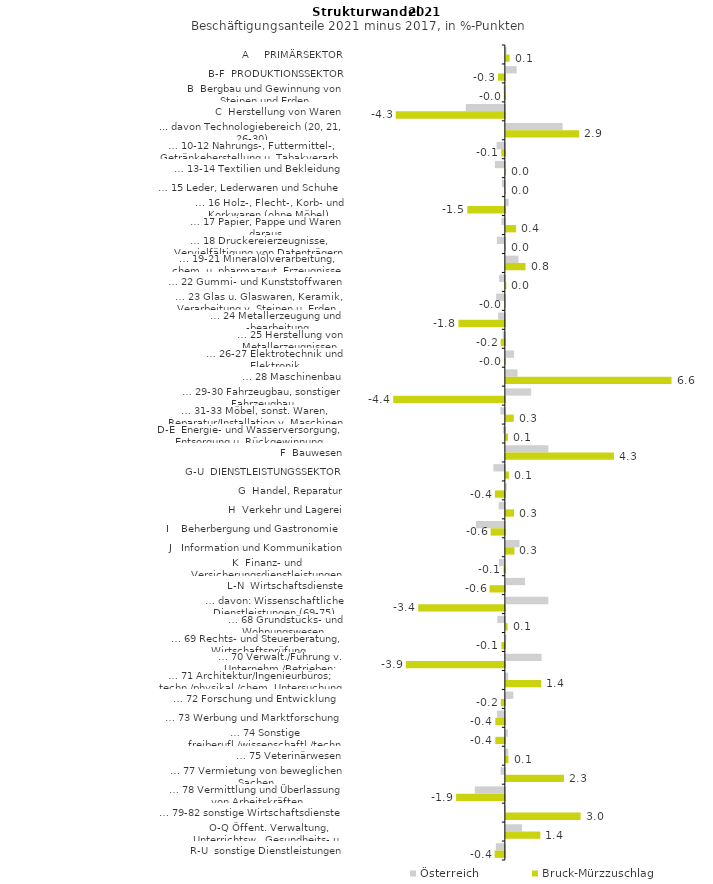
| Category | Österreich | Bruck-Mürzzuschlag |
|---|---|---|
| A     PRIMÄRSEKTOR | 0.029 | 0.15 |
| B-F  PRODUKTIONSSEKTOR | 0.429 | -0.272 |
| B  Bergbau und Gewinnung von Steinen und Erden | -0.054 | -0.041 |
| C  Herstellung von Waren | -1.552 | -4.341 |
| ... davon Technologiebereich (20, 21, 26-30) | 2.256 | 2.916 |
| … 10-12 Nahrungs-, Futtermittel-, Getränkeherstellung u. Tabakverarb. | -0.33 | -0.143 |
| … 13-14 Textilien und Bekleidung | -0.397 | 0.009 |
| … 15 Leder, Lederwaren und Schuhe | -0.119 | 0 |
| … 16 Holz-, Flecht-, Korb- und Korkwaren (ohne Möbel)  | 0.11 | -1.494 |
| … 17 Papier, Pappe und Waren daraus  | -0.136 | 0.409 |
| … 18 Druckereierzeugnisse, Vervielfältigung von Datenträgern | -0.317 | 0.004 |
| … 19-21 Mineralölverarbeitung, chem. u. pharmazeut. Erzeugnisse | 0.503 | 0.783 |
| … 22 Gummi- und Kunststoffwaren | -0.229 | 0.022 |
| … 23 Glas u. Glaswaren, Keramik, Verarbeitung v. Steinen u. Erden  | -0.345 | -0.009 |
| … 24 Metallerzeugung und -bearbeitung | -0.269 | -1.846 |
| … 25 Herstellung von Metallerzeugnissen  | -0.086 | -0.168 |
| … 26-27 Elektrotechnik und Elektronik | 0.325 | -0.018 |
| … 28 Maschinenbau | 0.465 | 6.59 |
| … 29-30 Fahrzeugbau, sonstiger Fahrzeugbau | 1.003 | -4.439 |
| … 31-33 Möbel, sonst. Waren, Reparatur/Installation v. Maschinen | -0.178 | 0.315 |
| D-E  Energie- und Wasserversorgung, Entsorgung u. Rückgewinnung | -0.083 | 0.083 |
| F  Bauwesen | 1.689 | 4.298 |
| G-U  DIENSTLEISTUNGSSEKTOR | -0.458 | 0.122 |
| G  Handel, Reparatur | 0.035 | -0.398 |
| H  Verkehr und Lagerei | -0.247 | 0.324 |
| I    Beherbergung und Gastronomie | -1.152 | -0.565 |
| J   Information und Kommunikation | 0.543 | 0.343 |
| K  Finanz- und Versicherungsdienstleistungen | -0.232 | -0.055 |
| L-N  Wirtschaftsdienste | 0.764 | -0.609 |
| … davon: Wissenschaftliche Dienstleistungen (69-75) | 1.689 | -3.445 |
| … 68 Grundstücks- und Wohnungswesen  | -0.302 | 0.067 |
| … 69 Rechts- und Steuerberatung, Wirtschaftsprüfung | 0.021 | -0.137 |
| … 70 Verwalt./Führung v. Unternehm./Betrieben; Unternehmensberat. | 1.422 | -3.933 |
| … 71 Architektur/Ingenieurbüros; techn./physikal./chem. Untersuchung | 0.093 | 1.407 |
| … 72 Forschung und Entwicklung  | 0.296 | -0.16 |
| … 73 Werbung und Marktforschung | -0.315 | -0.381 |
| … 74 Sonstige freiberufl./wissenschaftl./techn. Tätigkeiten | 0.077 | -0.379 |
| … 75 Veterinärwesen | 0.095 | 0.105 |
| … 77 Vermietung von beweglichen Sachen  | -0.17 | 2.312 |
| … 78 Vermittlung und Überlassung von Arbeitskräften | -1.195 | -1.94 |
| … 79-82 sonstige Wirtschaftsdienste | -0.022 | 2.975 |
| O-Q Öffent. Verwaltung, Unterrichtsw., Gesundheits- u. Sozialwesen | 0.646 | 1.371 |
| R-U  sonstige Dienstleistungen | -0.357 | -0.407 |